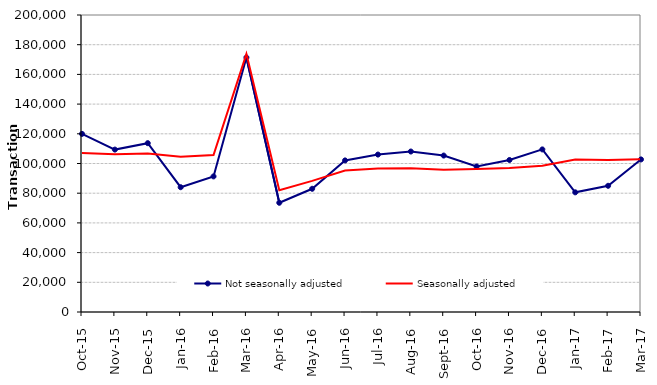
| Category | Not seasonally adjusted | Seasonally adjusted |
|---|---|---|
| 2015-10-01 | 119950 | 107040 |
| 2015-11-01 | 109370 | 106240 |
| 2015-12-01 | 113690 | 106780 |
| 2016-01-01 | 84030 | 104610 |
| 2016-02-01 | 91310 | 105740 |
| 2016-03-01 | 171370 | 173860 |
| 2016-04-01 | 73550 | 82060 |
| 2016-05-01 | 82980 | 88280 |
| 2016-06-01 | 102070 | 95220 |
| 2016-07-01 | 106020 | 96560 |
| 2016-08-01 | 108070 | 96800 |
| 2016-09-01 | 105350 | 95810 |
| 2016-10-01 | 98030 | 96260 |
| 2016-11-01 | 102360 | 96930 |
| 2016-12-01 | 109490 | 98420 |
| 2017-01-01 | 80580 | 102740 |
| 2017-02-01 | 84990 | 102290 |
| 2017-03-01 | 102740 | 102810 |